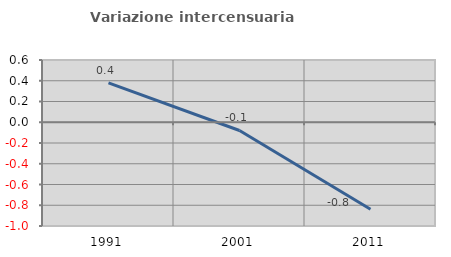
| Category | Variazione intercensuaria annua |
|---|---|
| 1991.0 | 0.38 |
| 2001.0 | -0.079 |
| 2011.0 | -0.839 |